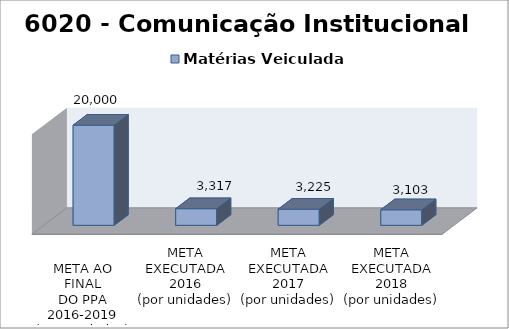
| Category | Matérias Veiculadas |
|---|---|
| 
META AO FINAL
DO PPA
2016-2019
(por unidades)
 | 20000 |
| META EXECUTADA
2016
(por unidades) | 3317 |
| META EXECUTADA
2017
(por unidades) | 3225 |
| META EXECUTADA
2018
(por unidades) | 3103 |